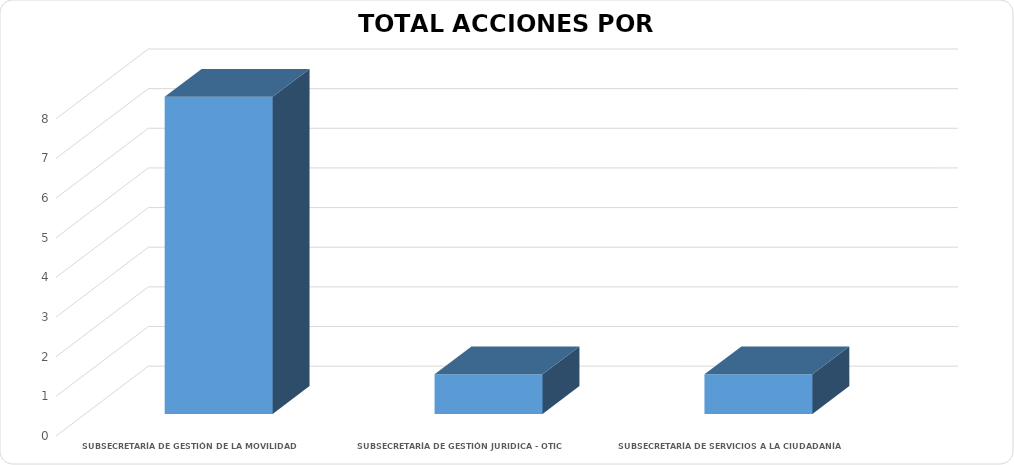
| Category | Cumplida Efectiva |
|---|---|
| SUBSECRETARÍA DE GESTIÓN DE LA MOVILIDAD | 8 |
| SUBSECRETARÍA DE GESTIÓN JURIDICA - OTIC | 1 |
| SUBSECRETARÍA DE SERVICIOS A LA CIUDADANÍA | 1 |